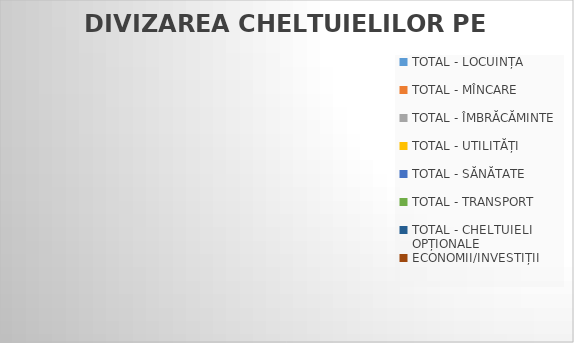
| Category | Series 0 |
|---|---|
| TOTAL - LOCUINȚA | 0 |
| TOTAL - MÎNCARE | 0 |
| TOTAL - ÎMBRĂCĂMINTE | 0 |
| TOTAL - UTILITĂȚI | 0 |
| TOTAL - SĂNĂTATE | 0 |
| TOTAL - TRANSPORT | 0 |
| TOTAL - CHELTUIELI OPȚIONALE | 0 |
| ECONOMII/INVESTIȚII | 0 |